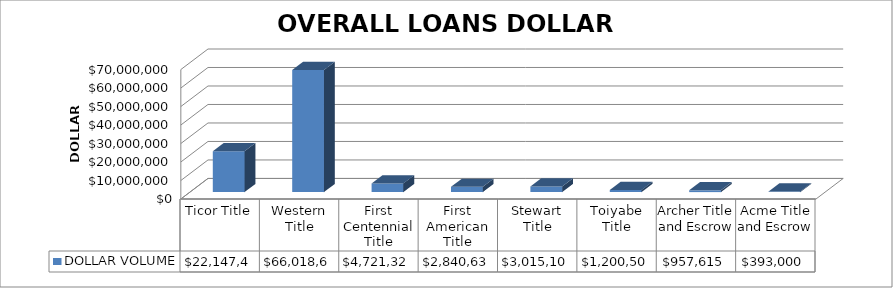
| Category | DOLLAR VOLUME |
|---|---|
| Ticor Title | 22147446 |
| Western Title | 66018666 |
| First Centennial Title | 4721325 |
| First American Title | 2840630 |
| Stewart Title | 3015101 |
| Toiyabe Title | 1200500 |
| Archer Title and Escrow | 957615 |
| Acme Title and Escrow | 393000 |